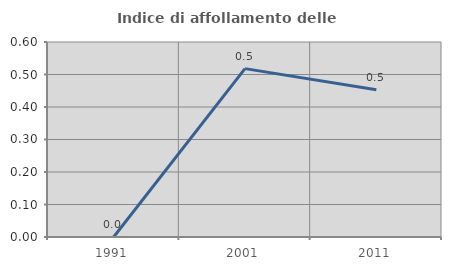
| Category | Indice di affollamento delle abitazioni  |
|---|---|
| 1991.0 | 0 |
| 2001.0 | 0.518 |
| 2011.0 | 0.453 |